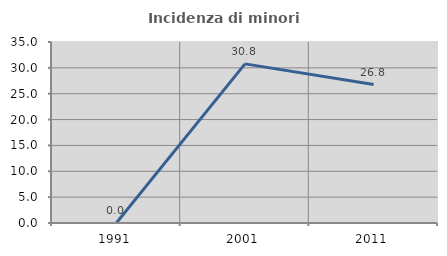
| Category | Incidenza di minori stranieri |
|---|---|
| 1991.0 | 0 |
| 2001.0 | 30.769 |
| 2011.0 | 26.778 |